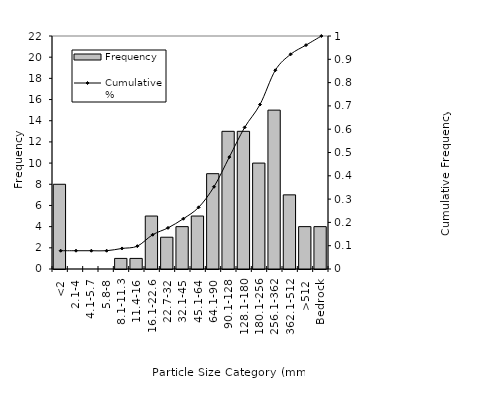
| Category | Frequency |
|---|---|
| <2 | 8 |
| 2.1-4 | 0 |
| 4.1-5.7 | 0 |
| 5.8-8 | 0 |
| 8.1-11.3 | 1 |
| 11.4-16 | 1 |
| 16.1-22.6 | 5 |
| 22.7-32 | 3 |
| 32.1-45 | 4 |
| 45.1-64 | 5 |
| 64.1-90 | 9 |
| 90.1-128 | 13 |
| 128.1-180 | 13 |
| 180.1-256 | 10 |
| 256.1-362 | 15 |
| 362.1-512 | 7 |
| >512 | 4 |
| Bedrock | 4 |